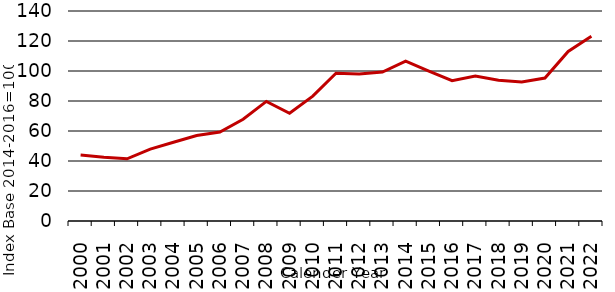
| Category | ab Finished Cattle Price Index |
|---|---|
| 2000.0 | 43.97 |
| 2001.0 | 42.513 |
| 2002.0 | 41.441 |
| 2003.0 | 47.897 |
| 2004.0 | 52.462 |
| 2005.0 | 56.957 |
| 2006.0 | 59.329 |
| 2007.0 | 67.797 |
| 2008.0 | 79.716 |
| 2009.0 | 71.84 |
| 2010.0 | 83.231 |
| 2011.0 | 98.479 |
| 2012.0 | 97.929 |
| 2013.0 | 99.271 |
| 2014.0 | 106.57 |
| 2015.0 | 99.909 |
| 2016.0 | 93.521 |
| 2017.0 | 96.709 |
| 2018.0 | 93.877 |
| 2019.0 | 92.705 |
| 2020.0 | 95.331 |
| 2021.0 | 113.047 |
| 2022.0 | 123.109 |